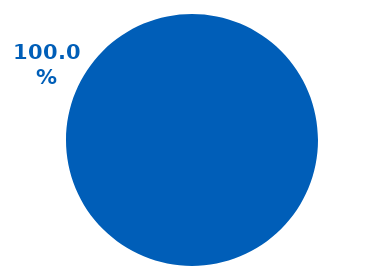
| Category | Series 4 | Series 5 | Series 6 | Series 7 | Series 2 | Series 3 | Series 1 | Series 0 |
|---|---|---|---|---|---|---|---|---|
| NACE | 1 | 1 | 1 | 1 | 1 | 1 | 1 | 1 |
| No_NACE | 0 | 0 | 0 | 0 | 0 | 0 | 0 | 0 |